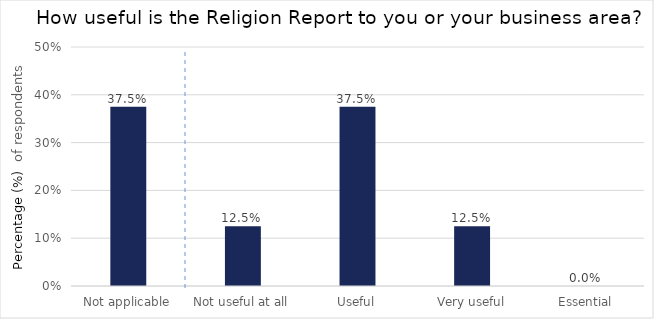
| Category | How useful is the Religion Report to you or your business area? |
|---|---|
| Not applicable | 0.375 |
| Not useful at all | 0.125 |
| Useful | 0.375 |
| Very useful | 0.125 |
| Essential | 0 |